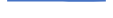
| Category | Series 0 |
|---|---|
| 0 | 74 |
| 1 | 70 |
| 2 | 93 |
| 3 | 73 |
| 4 | 87 |
| 5 | 62 |
| 6 | 68 |
| 7 | 59 |
| 8 | 78 |